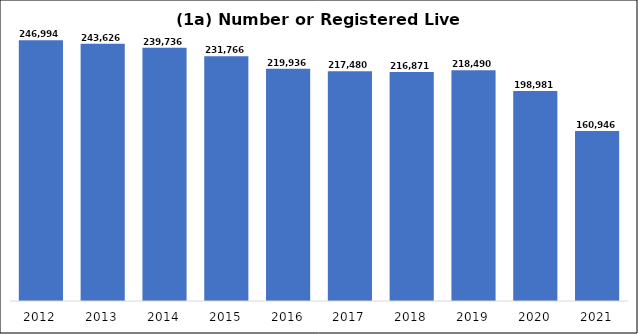
| Category | Series 0 |
|---|---|
| 2012.0 | 246994 |
| 2013.0 | 243626 |
| 2014.0 | 239736 |
| 2015.0 | 231766 |
| 2016.0 | 219936 |
| 2017.0 | 217480 |
| 2018.0 | 216871 |
| 2019.0 | 218490 |
| 2020.0 | 198981 |
| 2021.0 | 160946 |